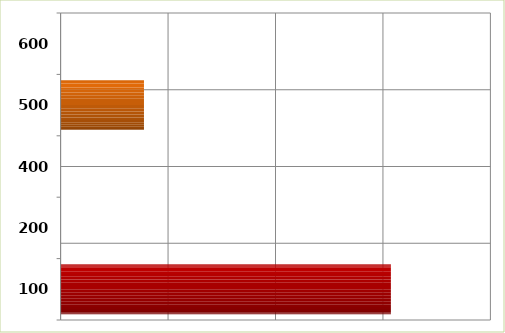
| Category | Series 0 |
|---|---|
| 100.0 | 307385121.34 |
| 200.0 | 0 |
| 400.0 | 0 |
| 500.0 | 77591400.56 |
| 600.0 | 0 |